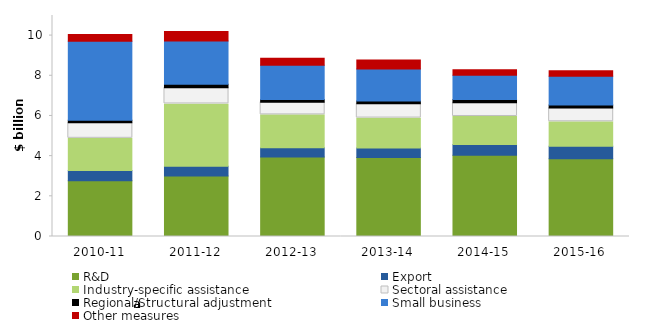
| Category | R&D | Export | Industry-specific assistance | Sectoral assistance | Regional/Structural adjustment | Small business | Other measures |
|---|---|---|---|---|---|---|---|
| 2010-11 | 2.775 | 0.517 | 1.596 | 0.777 | 0.118 | 3.931 | 0.345 |
| 2011-12 | 3.009 | 0.487 | 3.102 | 0.808 | 0.168 | 2.152 | 0.48 |
| 2012-13 | 3.952 | 0.464 | 1.638 | 0.632 | 0.135 | 1.698 | 0.347 |
| 2013-14 | 3.938 | 0.462 | 1.496 | 0.707 | 0.142 | 1.587 | 0.447 |
| 2014-15 | 4.045 | 0.528 | 1.4 | 0.684 | 0.159 | 1.205 | 0.279 |
| 2015-16 | 3.87 | 0.622 | 1.219 | 0.679 | 0.161 | 1.425 | 0.278 |